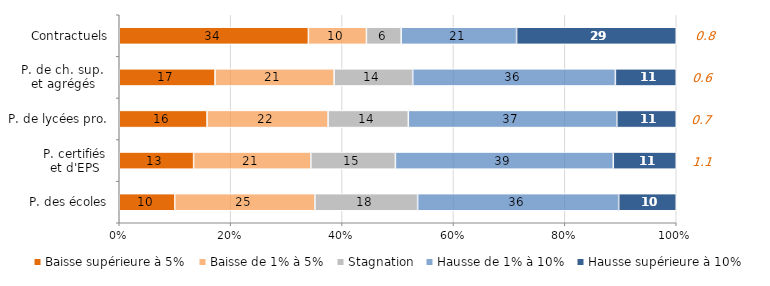
| Category | Baisse supérieure à 5% | Baisse de 1% à 5% | Stagnation | Hausse de 1% à 10% | Hausse supérieure à 10% |
|---|---|---|---|---|---|
| P. des écoles | 9.963 | 25.167 | 18.439 | 36.098 | 10.332 |
| P. certifiés
et d'EPS | 13.353 | 21.047 | 15.177 | 39.122 | 11.302 |
| P. de lycées pro. | 15.765 | 21.727 | 14.409 | 37.428 | 10.67 |
| P. de ch. sup. 
et agrégés | 17.201 | 21.372 | 14.112 | 36.387 | 10.928 |
| Contractuels | 33.961 | 10.418 | 6.236 | 20.72 | 28.665 |